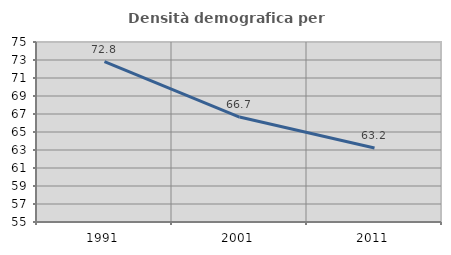
| Category | Densità demografica |
|---|---|
| 1991.0 | 72.826 |
| 2001.0 | 66.658 |
| 2011.0 | 63.218 |